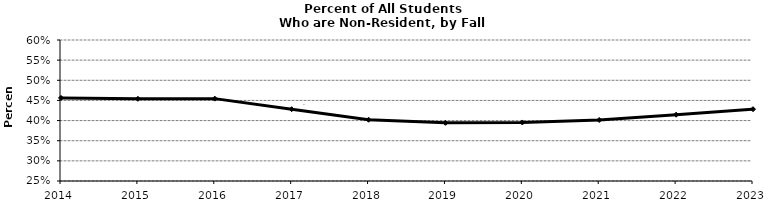
| Category | Percent Non-Resident |
|---|---|
| 2014.0 | 0.456 |
| 2015.0 | 0.454 |
| 2016.0 | 0.454 |
| 2017.0 | 0.428 |
| 2018.0 | 0.402 |
| 2019.0 | 0.394 |
| 2020.0 | 0.395 |
| 2021.0 | 0.401 |
| 2022.0 | 0.415 |
| 2023.0 | 0.428 |